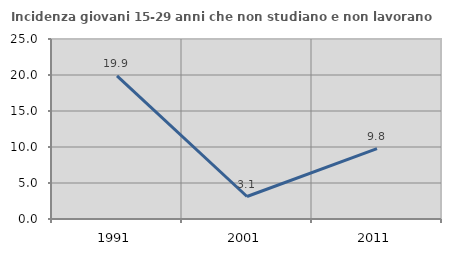
| Category | Incidenza giovani 15-29 anni che non studiano e non lavorano  |
|---|---|
| 1991.0 | 19.872 |
| 2001.0 | 3.125 |
| 2011.0 | 9.783 |